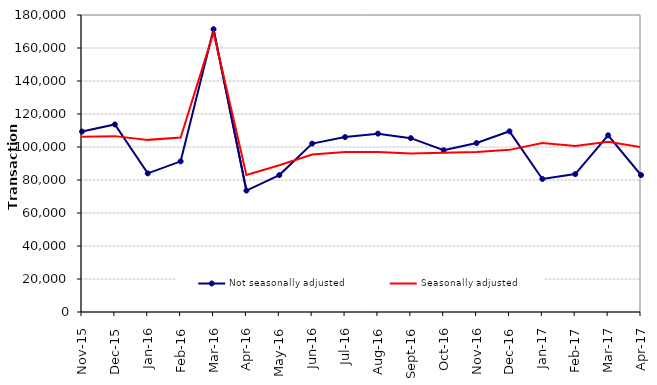
| Category | Not seasonally adjusted | Seasonally adjusted |
|---|---|---|
| 2015-11-01 | 109370 | 106230 |
| 2015-12-01 | 113690 | 106590 |
| 2016-01-01 | 84030 | 104320 |
| 2016-02-01 | 91310 | 105780 |
| 2016-03-01 | 171370 | 169440 |
| 2016-04-01 | 73570 | 83050 |
| 2016-05-01 | 82980 | 88900 |
| 2016-06-01 | 102070 | 95450 |
| 2016-07-01 | 106020 | 96950 |
| 2016-08-01 | 108090 | 96910 |
| 2016-09-01 | 105360 | 95990 |
| 2016-10-01 | 98040 | 96520 |
| 2016-11-01 | 102390 | 96930 |
| 2016-12-01 | 109510 | 98260 |
| 2017-01-01 | 80620 | 102460 |
| 2017-02-01 | 83570 | 100680 |
| 2017-03-01 | 107090 | 103220 |
| 2017-04-01 | 83010 | 99910 |